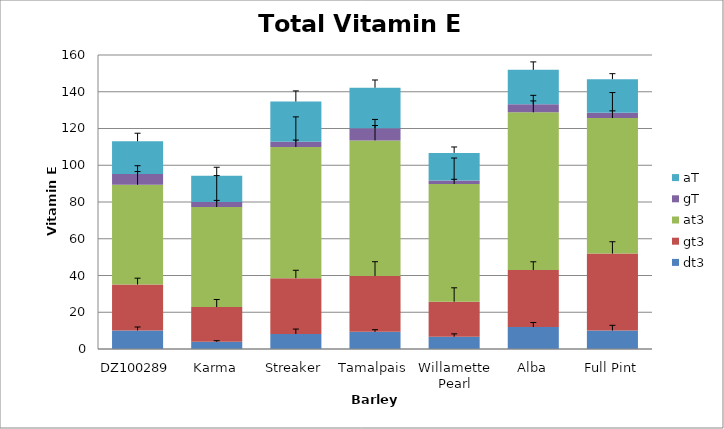
| Category | dt3 | gt3 | at3 | gT | aT |
|---|---|---|---|---|---|
| DZ100289 | 10.108 | 24.995 | 54.305 | 5.855 | 17.775 |
| Karma | 3.912 | 18.899 | 54.451 | 2.724 | 14.358 |
| Streaker | 8.173 | 30.364 | 71.385 | 2.815 | 21.927 |
| Tamalpais | 9.322 | 30.404 | 73.799 | 6.639 | 22.013 |
| Willamette Pearl | 6.726 | 18.989 | 64.078 | 1.911 | 15.006 |
| Alba | 11.964 | 30.984 | 85.846 | 4.34 | 18.782 |
| Full Pint | 10.038 | 41.871 | 73.772 | 2.893 | 18.284 |